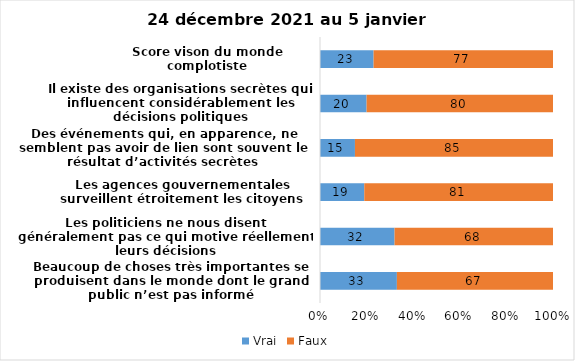
| Category | Vrai | Faux |
|---|---|---|
| Beaucoup de choses très importantes se produisent dans le monde dont le grand public n’est pas informé | 33 | 67 |
| Les politiciens ne nous disent généralement pas ce qui motive réellement leurs décisions | 32 | 68 |
| Les agences gouvernementales surveillent étroitement les citoyens | 19 | 81 |
| Des événements qui, en apparence, ne semblent pas avoir de lien sont souvent le résultat d’activités secrètes | 15 | 85 |
| Il existe des organisations secrètes qui influencent considérablement les décisions politiques | 20 | 80 |
| Score vison du monde complotiste | 23 | 77 |